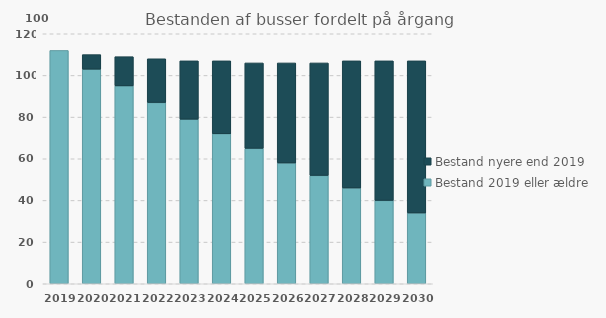
| Category | Bestand 2019 eller ældre | Bestand nyere end 2019 |
|---|---|---|
| 2019 | 112 | 0 |
| 2020 | 103 | 7 |
| 2021 | 95 | 14 |
| 2022 | 87 | 21 |
| 2023 | 79 | 28 |
| 2024 | 72 | 35 |
| 2025 | 65 | 41 |
| 2026 | 58 | 48 |
| 2027 | 52 | 54 |
| 2028 | 46 | 61 |
| 2029 | 40 | 67 |
| 2030 | 34 | 73 |